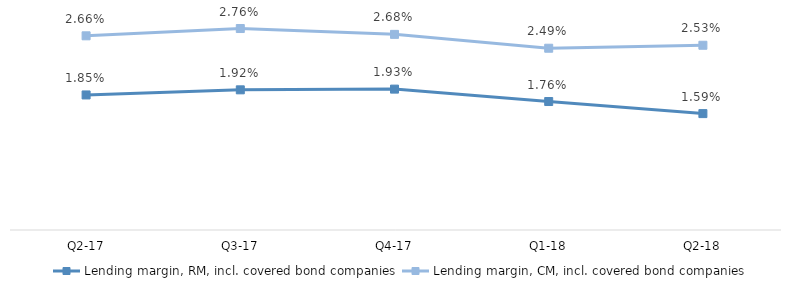
| Category | Lending margin, RM, incl. covered bond companies | Lending margin, CM, incl. covered bond companies |
|---|---|---|
| Q2-18 | 0.016 | 0.025 |
| Q1-18 | 0.018 | 0.025 |
| Q4-17 | 0.019 | 0.027 |
| Q3-17 | 0.019 | 0.028 |
| Q2-17 | 0.018 | 0.027 |